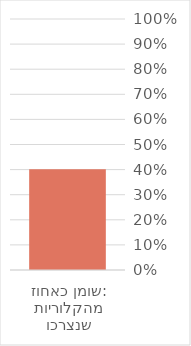
| Category | Series 0 |
|---|---|
| שומן כאחוז מהקלוריות שנצרכו: | 0.402 |